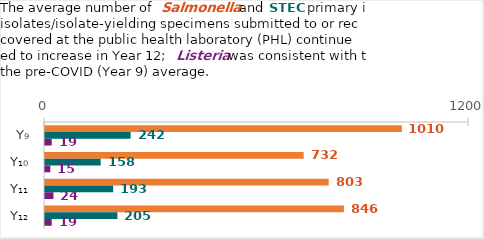
| Category | Salmonella | STEC | Listeria |
|---|---|---|---|
| Y₉ | 1010 | 242.333 | 19 |
| Y₁₀ | 732.1 | 157.6 | 15 |
| Y₁₁ | 803 | 193 | 24 |
| Y₁₂ | 846 | 205 | 19 |